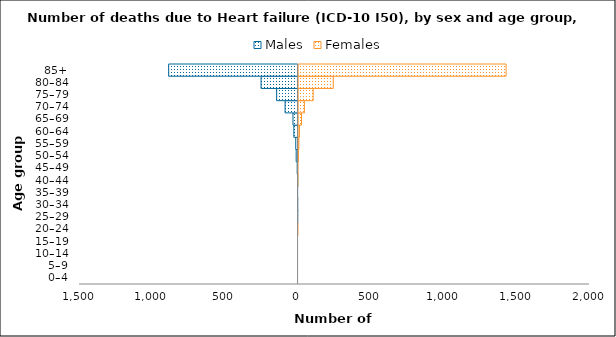
| Category | Males | Females |
|---|---|---|
| 0–4 | 0 | 0 |
| 5–9 | 0 | 0 |
| 10–14 | 0 | 0 |
| 15–19 | 0 | 0 |
| 20–24 | 0 | 1 |
| 25–29 | -1 | 0 |
| 30–34 | -1 | 0 |
| 35–39 | -3 | 0 |
| 40–44 | -1 | 1 |
| 45–49 | -6 | 2 |
| 50–54 | -13 | 5 |
| 55–59 | -16 | 9 |
| 60–64 | -29 | 13 |
| 65–69 | -35 | 27 |
| 70–74 | -89 | 47 |
| 75–79 | -147 | 107 |
| 80–84 | -254 | 245 |
| 85+ | -888 | 1431 |